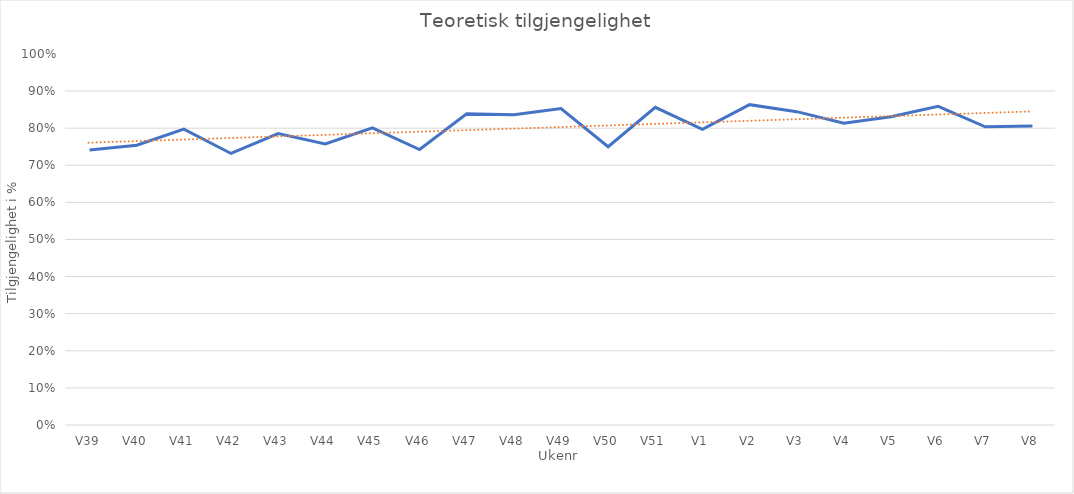
| Category | Teoretisk |
|---|---|
| V39 | 0.741 |
| V40 | 0.754 |
| V41 | 0.798 |
| V42 | 0.732 |
| V43 | 0.786 |
| V44 | 0.757 |
| V45 | 0.801 |
| V46 | 0.743 |
| V47 | 0.839 |
| V48 | 0.836 |
| V49 | 0.853 |
| V50 | 0.75 |
| V51 | 0.856 |
| V1 | 0.797 |
| V2 | 0.863 |
| V3 | 0.845 |
| V4 | 0.813 |
| V5 | 0.831 |
| V6 | 0.859 |
| V7 | 0.804 |
| V8 | 0.806 |